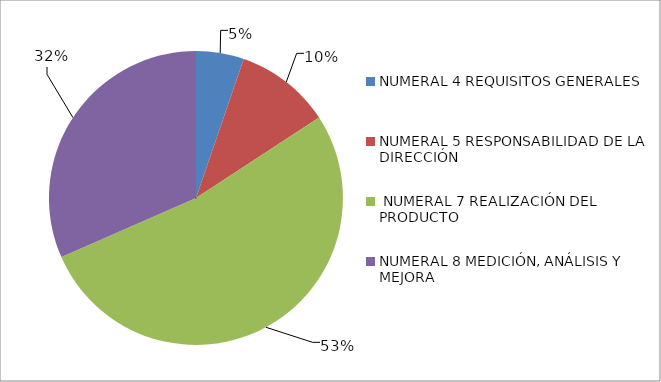
| Category | Series 0 |
|---|---|
| NUMERAL 4 REQUISITOS GENERALES | 1 |
| NUMERAL 5 RESPONSABILIDAD DE LA DIRECCIÓN | 2 |
|  NUMERAL 7 REALIZACIÓN DEL PRODUCTO | 10 |
| NUMERAL 8 MEDICIÓN, ANÁLISIS Y MEJORA | 6 |